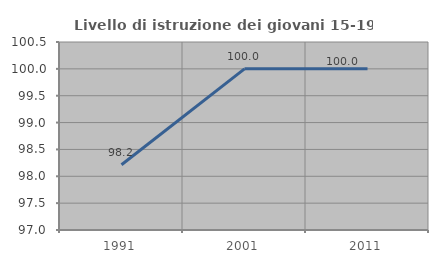
| Category | Livello di istruzione dei giovani 15-19 anni |
|---|---|
| 1991.0 | 98.214 |
| 2001.0 | 100 |
| 2011.0 | 100 |